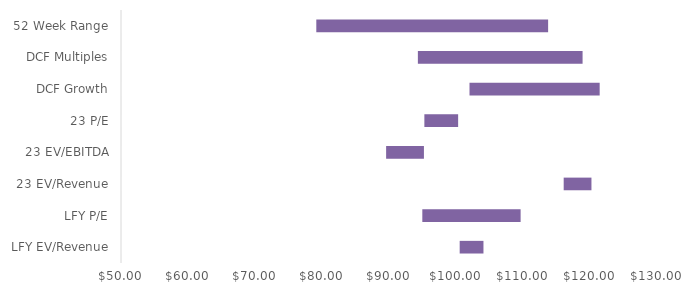
| Category | Series 0 | Series 1 |
|---|---|---|
| LFY EV/Revenue | 100.549 | 3.55 |
| LFY P/E | 94.974 | 14.671 |
| 23 EV/Revenue | 116.073 | 4.145 |
| 23 EV/EBITDA | 89.571 | 5.642 |
| 23 P/E | 95.279 | 5.04 |
| DCF Growth | 102.016 | 19.428 |
| DCF Multiples | 94.31 | 24.583 |
| 52 Week Range | 79.15 | 34.6 |